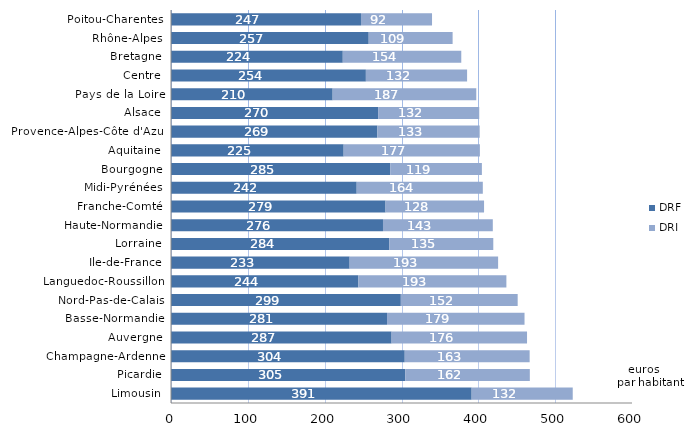
| Category | DRF | DRI |
|---|---|---|
| Limousin | 391.309 | 131.556 |
| Picardie | 305.017 | 162.003 |
| Champagne-Ardenne | 304.223 | 162.571 |
| Auvergne | 287.127 | 176.258 |
| Basse-Normandie | 281.155 | 178.963 |
| Nord-Pas-de-Calais | 299.138 | 152.07 |
| Languedoc-Roussillon | 243.919 | 192.59 |
| Ile-de-France | 232.501 | 193.241 |
| Lorraine | 284.007 | 135.461 |
| Haute-Normandie | 275.911 | 142.92 |
| Franche-Comté | 279.241 | 128.206 |
| Midi-Pyrénées | 241.699 | 164.137 |
| Bourgogne | 285.351 | 119.266 |
| Aquitaine | 224.73 | 177.298 |
| Provence-Alpes-Côte d'Azur | 268.593 | 133.157 |
| Alsace | 269.606 | 131.559 |
| Pays de la Loire | 210.4 | 186.938 |
| Centre | 253.643 | 131.728 |
| Bretagne | 223.577 | 154.219 |
| Rhône-Alpes | 257.326 | 109.2 |
| Poitou-Charentes | 247.278 | 92.454 |